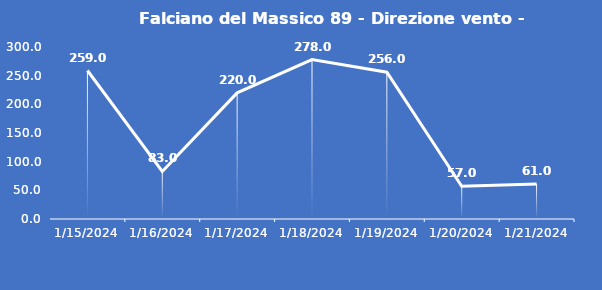
| Category | Falciano del Massico 89 - Direzione vento - Grezzo (°N) |
|---|---|
| 1/15/24 | 259 |
| 1/16/24 | 83 |
| 1/17/24 | 220 |
| 1/18/24 | 278 |
| 1/19/24 | 256 |
| 1/20/24 | 57 |
| 1/21/24 | 61 |